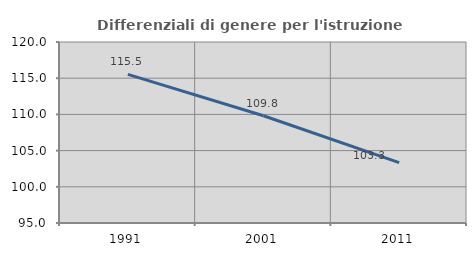
| Category | Differenziali di genere per l'istruzione superiore |
|---|---|
| 1991.0 | 115.528 |
| 2001.0 | 109.812 |
| 2011.0 | 103.34 |